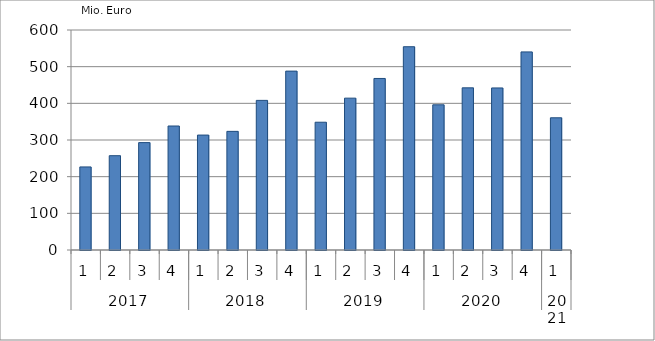
| Category | Ausbaugewerblicher Umsatz3 |
|---|---|
| 0 | 226552.317 |
| 1 | 257191.13 |
| 2 | 292853.372 |
| 3 | 338154.691 |
| 4 | 313433.569 |
| 5 | 323547.694 |
| 6 | 408057.42 |
| 7 | 487843.765 |
| 8 | 348466.115 |
| 9 | 414145.554 |
| 10 | 467849.207 |
| 11 | 554369.34 |
| 12 | 395996.128 |
| 13 | 442270.528 |
| 14 | 441987.109 |
| 15 | 540250.513 |
| 16 | 360578.959 |